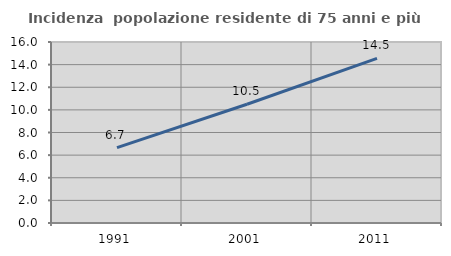
| Category | Incidenza  popolazione residente di 75 anni e più |
|---|---|
| 1991.0 | 6.667 |
| 2001.0 | 10.496 |
| 2011.0 | 14.545 |